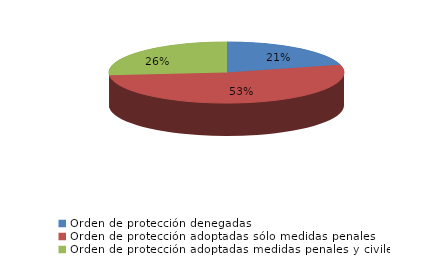
| Category | Series 0 |
|---|---|
| Orden de protección denegadas | 81 |
| Orden de protección adoptadas sólo medidas penales | 204 |
| Orden de protección adoptadas medidas penales y civiles | 102 |